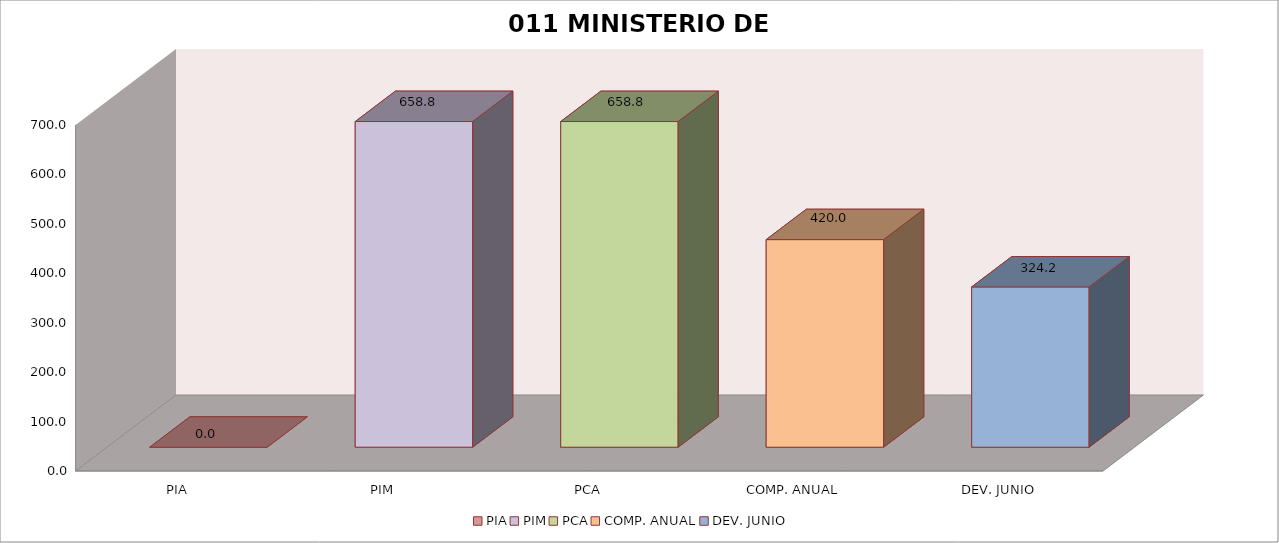
| Category | 011 MINISTERIO DE SALUD |
|---|---|
| PIA | 0 |
| PIM | 658.831 |
| PCA | 658.831 |
| COMP. ANUAL | 419.969 |
| DEV. JUNIO | 324.212 |